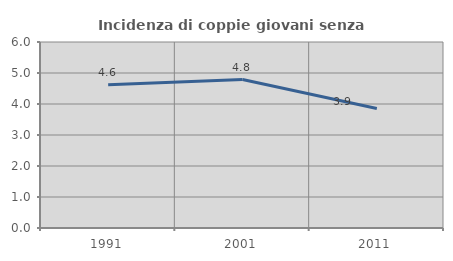
| Category | Incidenza di coppie giovani senza figli |
|---|---|
| 1991.0 | 4.617 |
| 2001.0 | 4.787 |
| 2011.0 | 3.853 |